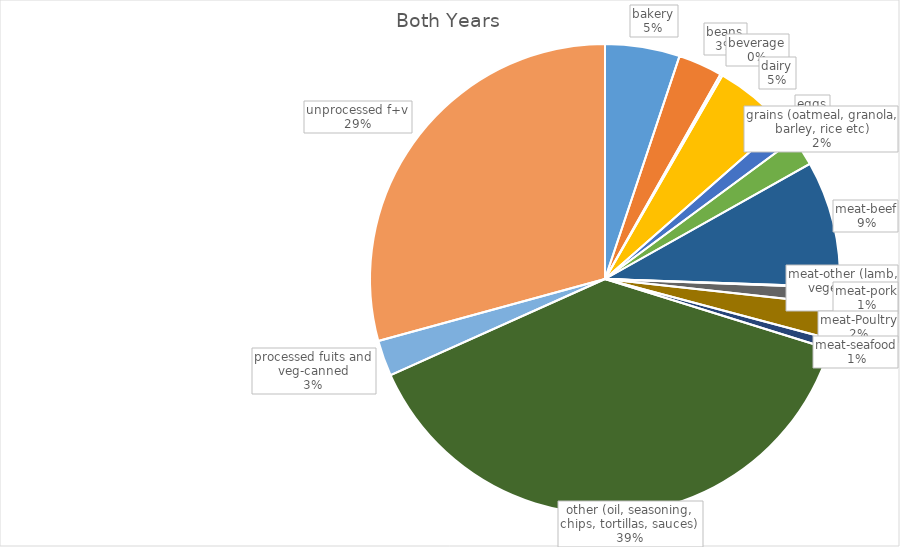
| Category | Series 0 |
|---|---|
| bakery | 226429 |
| beans | 133940 |
| beverage | 6812 |
| dairy | 229459 |
| eggs | 58974 |
| grains (oatmeal, granola, barley, rice etc) | 87189 |
| meat-beef | 383578 |
| meat-other (lamb, vegetarian) | 3130 |
| meat-pork | 49527 |
| meat-Poultry | 106265 |
| meat-seafood | 29120 |
| other (oil, seasoning, chips, tortillas, sauces) | 1696955 |
| processed fuits and veg-canned | 108201 |
| unprocessed f+v | 1289988 |